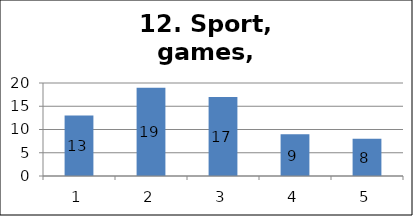
| Category | Series 1 |
|---|---|
| 0 | 13 |
| 1 | 19 |
| 2 | 17 |
| 3 | 9 |
| 4 | 8 |